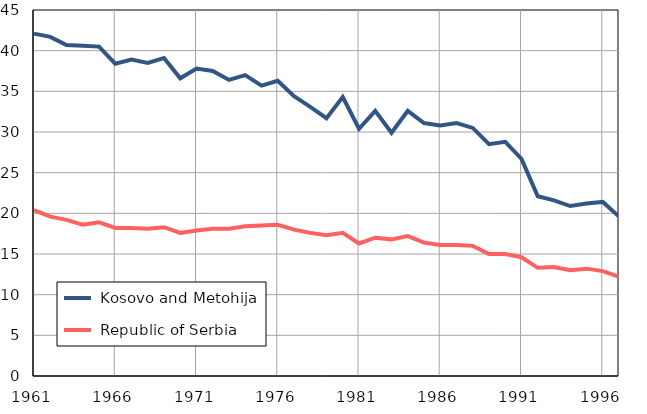
| Category |  Kosovo and Metohija |  Republic of Serbia |
|---|---|---|
| 1961.0 | 42.1 | 20.4 |
| 1962.0 | 41.7 | 19.6 |
| 1963.0 | 40.7 | 19.2 |
| 1964.0 | 40.6 | 18.6 |
| 1965.0 | 40.5 | 18.9 |
| 1966.0 | 38.4 | 18.2 |
| 1967.0 | 38.9 | 18.2 |
| 1968.0 | 38.5 | 18.1 |
| 1969.0 | 39.1 | 18.3 |
| 1970.0 | 36.6 | 17.6 |
| 1971.0 | 37.8 | 17.9 |
| 1972.0 | 37.5 | 18.1 |
| 1973.0 | 36.4 | 18.1 |
| 1974.0 | 37 | 18.4 |
| 1975.0 | 35.7 | 18.5 |
| 1976.0 | 36.3 | 18.6 |
| 1977.0 | 34.4 | 18 |
| 1978.0 | 33.1 | 17.6 |
| 1979.0 | 31.7 | 17.3 |
| 1980.0 | 34.3 | 17.6 |
| 1981.0 | 30.4 | 16.3 |
| 1982.0 | 32.6 | 17 |
| 1983.0 | 29.9 | 16.8 |
| 1984.0 | 32.6 | 17.2 |
| 1985.0 | 31.1 | 16.4 |
| 1986.0 | 30.8 | 16.1 |
| 1987.0 | 31.1 | 16.1 |
| 1988.0 | 30.5 | 16 |
| 1989.0 | 28.5 | 15 |
| 1990.0 | 28.8 | 15 |
| 1991.0 | 26.7 | 14.6 |
| 1992.0 | 22.1 | 13.3 |
| 1993.0 | 21.6 | 13.4 |
| 1994.0 | 20.9 | 13 |
| 1995.0 | 21.2 | 13.2 |
| 1996.0 | 21.4 | 12.9 |
| 1997.0 | 19.6 | 12.2 |